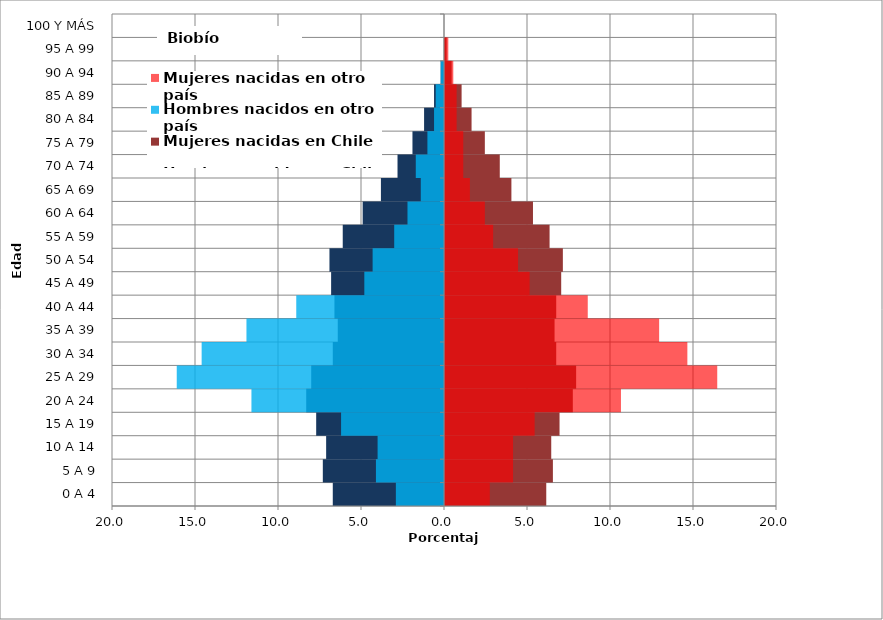
| Category | Hombres nacidos en Chile | Mujeres nacidas en Chile | Hombres nacidos en otro país | Mujeres nacidas en otro país |
|---|---|---|---|---|
| 0 A 4 | -6.7 | 6.1 | -2.9 | 2.7 |
| 5 A 9 | -7.3 | 6.5 | -4.1 | 4.1 |
| 10 A 14 | -7.1 | 6.4 | -4 | 4.1 |
| 15 A 19 | -7.7 | 6.9 | -6.2 | 5.4 |
| 20 A 24 | -8.3 | 7.7 | -11.6 | 10.6 |
| 25 A 29 | -8 | 7.9 | -16.1 | 16.4 |
| 30 A 34 | -6.7 | 6.7 | -14.6 | 14.6 |
| 35 A 39 | -6.4 | 6.6 | -11.9 | 12.9 |
| 40 A 44 | -6.6 | 6.7 | -8.9 | 8.6 |
| 45 A 49 | -6.8 | 7 | -4.8 | 5.1 |
| 50 A 54 | -6.9 | 7.1 | -4.3 | 4.4 |
| 55 A 59 | -6.1 | 6.3 | -3 | 2.9 |
| 60 A 64 | -4.9 | 5.3 | -2.2 | 2.4 |
| 65 A 69 | -3.8 | 4 | -1.4 | 1.5 |
| 70 A 74 | -2.8 | 3.3 | -1.7 | 1.1 |
| 75 A 79 | -1.9 | 2.4 | -1 | 1.1 |
| 80 A 84 | -1.2 | 1.6 | -0.6 | 0.7 |
| 85 A 89 | -0.6 | 1 | -0.5 | 0.7 |
| 90 A 94 | -0.2 | 0.4 | -0.2 | 0.5 |
| 95 A 99 | 0 | 0.1 | 0 | 0.2 |
| 100 Y MÁS | 0 | 0 | 0 | 0 |